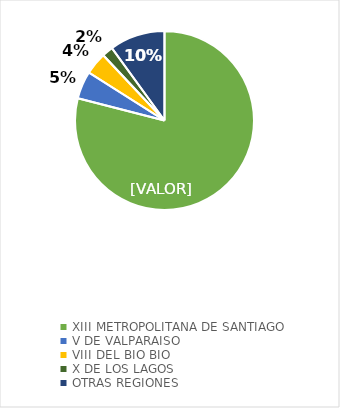
| Category | Series 0 |
|---|---|
| XIII METROPOLITANA DE SANTIAGO | 0.79 |
| V DE VALPARAISO | 0.05 |
| VIII DEL BIO BIO | 0.04 |
| X DE LOS LAGOS | 0.02 |
| OTRAS REGIONES | 0.1 |